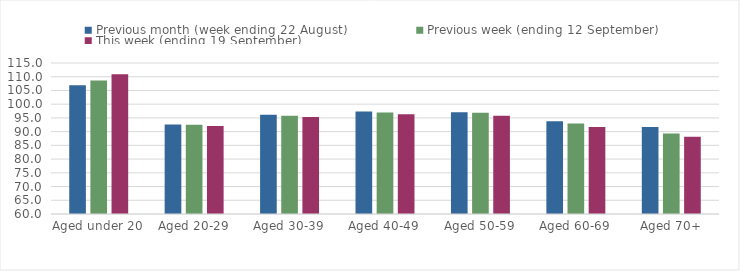
| Category | Previous month (week ending 22 August) | Previous week (ending 12 September) | This week (ending 19 September) |
|---|---|---|---|
| Aged under 20 | 106.89 | 108.66 | 110.93 |
| Aged 20-29 | 92.58 | 92.55 | 92.05 |
| Aged 30-39 | 96.15 | 95.77 | 95.29 |
| Aged 40-49 | 97.3 | 96.96 | 96.3 |
| Aged 50-59 | 97.02 | 96.87 | 95.78 |
| Aged 60-69 | 93.81 | 92.92 | 91.7 |
| Aged 70+ | 91.69 | 89.34 | 88.13 |